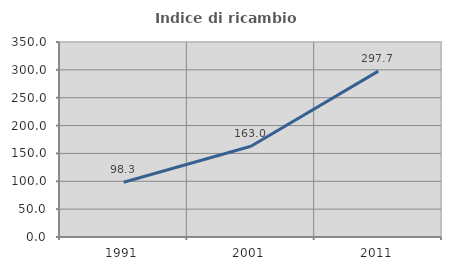
| Category | Indice di ricambio occupazionale  |
|---|---|
| 1991.0 | 98.345 |
| 2001.0 | 162.963 |
| 2011.0 | 297.701 |